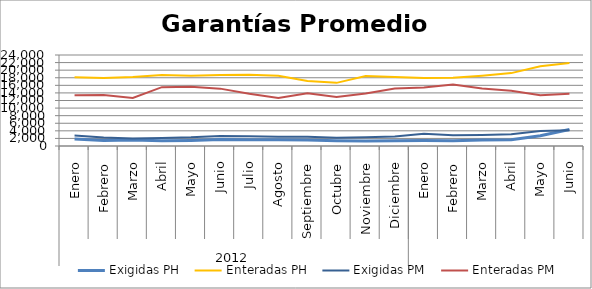
| Category | Exigidas PH | Enteradas PH | Exigidas PM | Enteradas PM |
|---|---|---|---|---|
| 0 | 1828.564 | 18155.583 | 2744.93 | 13413.991 |
| 1 | 1451.155 | 17917.734 | 2215.902 | 13440.832 |
| 2 | 1587.31 | 18166.129 | 1968.766 | 12673.714 |
| 3 | 1353.003 | 18741.256 | 2118.782 | 15515.723 |
| 4 | 1464.668 | 18540.927 | 2278.002 | 15625.393 |
| 5 | 1719.43 | 18734.539 | 2626.915 | 15127.903 |
| 6 | 1674.023 | 18761.463 | 2556.575 | 13766.49 |
| 7 | 1647.243 | 18544.546 | 2463.76 | 12637.427 |
| 8 | 1556.152 | 17124.972 | 2459.803 | 13929.715 |
| 9 | 1402.926 | 16653.067 | 2169.047 | 12937.81 |
| 10 | 1329.011 | 18467.462 | 2322.009 | 13825.53 |
| 11 | 1379.519 | 18204.98 | 2522.413 | 15188.776 |
| 12 | 1462.675 | 17957.148 | 3246.817 | 15415.235 |
| 13 | 1398.609 | 17993.637 | 2845.352 | 16230.589 |
| 14 | 1589.589 | 18548.479 | 2894.834 | 15192.36 |
| 15 | 1623.519 | 19220.98 | 3086.854 | 14555.102 |
| 16 | 2700.009 | 21053.59 | 3968.296 | 13386.678 |
| 17 | 4335.591 | 21872.028 | 4126.324 | 13759.513 |